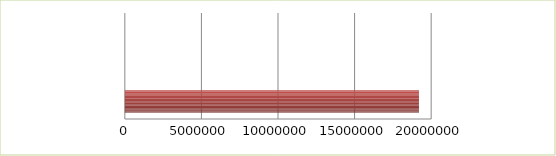
| Category | Series 0 | Series 1 |
|---|---|---|
| 0 | 2.5 | 19203237 |
| 1 | 2.6 | 0 |
| 2 | 2.7 | 0 |